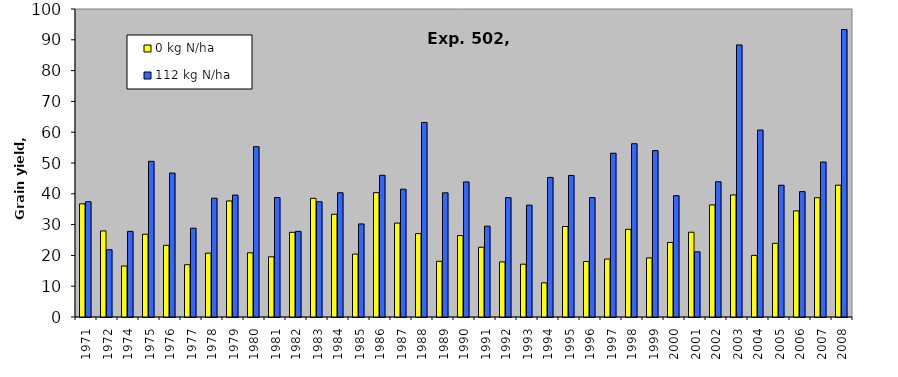
| Category | 0 kg N/ha | 112 kg N/ha |
|---|---|---|
| 1971.0 | 36.725 | 37.425 |
| 1972.0 | 27.95 | 21.84 |
| 1974.0 | 16.547 | 27.8 |
| 1975.0 | 26.862 | 50.548 |
| 1976.0 | 23.262 | 46.736 |
| 1977.0 | 16.97 | 28.828 |
| 1978.0 | 20.721 | 38.569 |
| 1979.0 | 37.675 | 39.582 |
| 1980.0 | 20.842 | 55.298 |
| 1981.0 | 19.542 | 38.782 |
| 1982.0 | 27.498 | 27.8 |
| 1983.0 | 38.538 | 37.418 |
| 1984.0 | 33.365 | 40.35 |
| 1985.0 | 20.418 | 30.22 |
| 1986.0 | 40.382 | 46.01 |
| 1987.0 | 30.492 | 41.502 |
| 1988.0 | 27.072 | 63.16 |
| 1989.0 | 18.09 | 40.322 |
| 1990.0 | 26.438 | 43.862 |
| 1991.0 | 22.655 | 29.49 |
| 1992.0 | 17.89 | 38.747 |
| 1993.0 | 17.152 | 36.318 |
| 1994.0 | 11.093 | 45.314 |
| 1995.0 | 29.386 | 45.956 |
| 1996.0 | 18.014 | 38.763 |
| 1997.0 | 18.808 | 53.168 |
| 1998.0 | 28.464 | 56.252 |
| 1999.0 | 19.184 | 54.027 |
| 2000.0 | 24.207 | 39.397 |
| 2001.0 | 27.522 | 21.164 |
| 2002.0 | 36.399 | 43.916 |
| 2003.0 | 39.634 | 88.329 |
| 2004.0 | 20 | 60.7 |
| 2005.0 | 23.917 | 42.78 |
| 2006.0 | 34.46 | 40.71 |
| 2007.0 | 38.73 | 50.31 |
| 2008.0 | 42.8 | 93.333 |